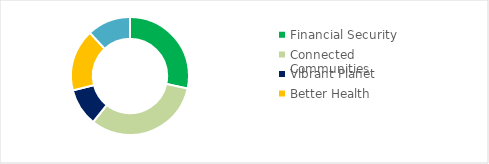
| Category | Series 0 |
|---|---|
| Financial Security | 0.284 |
| Connected Communities | 0.323 |
| Vibrant Planet | 0.103 |
| Better Health | 0.17 |
| Other | 0.119 |